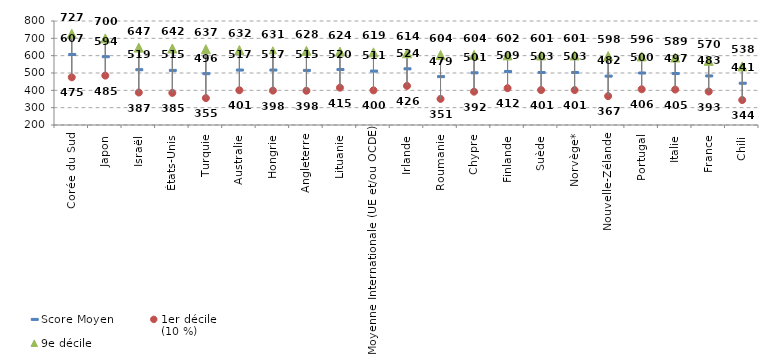
| Category | Score Moyen | 1er décile 
(10 %) | 9e décile 
(90 %) |
|---|---|---|---|
| Corée du Sud | 607 | 474.985 | 726.621 |
| Japon | 594 | 484.99 | 699.802 |
| Israël | 519 | 387.463 | 646.642 |
| États-Unis | 515 | 385.078 | 641.509 |
| Turquie | 496 | 355.083 | 637.057 |
| Australie | 517 | 400.574 | 632.279 |
| Hongrie | 517 | 398.456 | 630.845 |
| Angleterre | 515 | 397.523 | 628.113 |
| Lituanie | 520 | 415.362 | 623.753 |
| Moyenne Internationale (UE et/ou OCDE) | 511 | 399.874 | 619.19 |
| Irlande | 524 | 425.683 | 613.87 |
| Roumanie | 479 | 350.553 | 604.273 |
| Chypre | 501 | 392.256 | 604.092 |
| Finlande | 509 | 412.47 | 601.678 |
| Suède | 503 | 401.356 | 601.302 |
| Norvège* | 503 | 401.444 | 601.233 |
| Nouvelle-Zélande | 482 | 366.521 | 597.621 |
| Portugal | 500 | 406.131 | 595.758 |
| Italie | 497 | 404.533 | 589.183 |
| France | 483 | 393.052 | 570.106 |
| Chili | 441 | 343.958 | 538.058 |